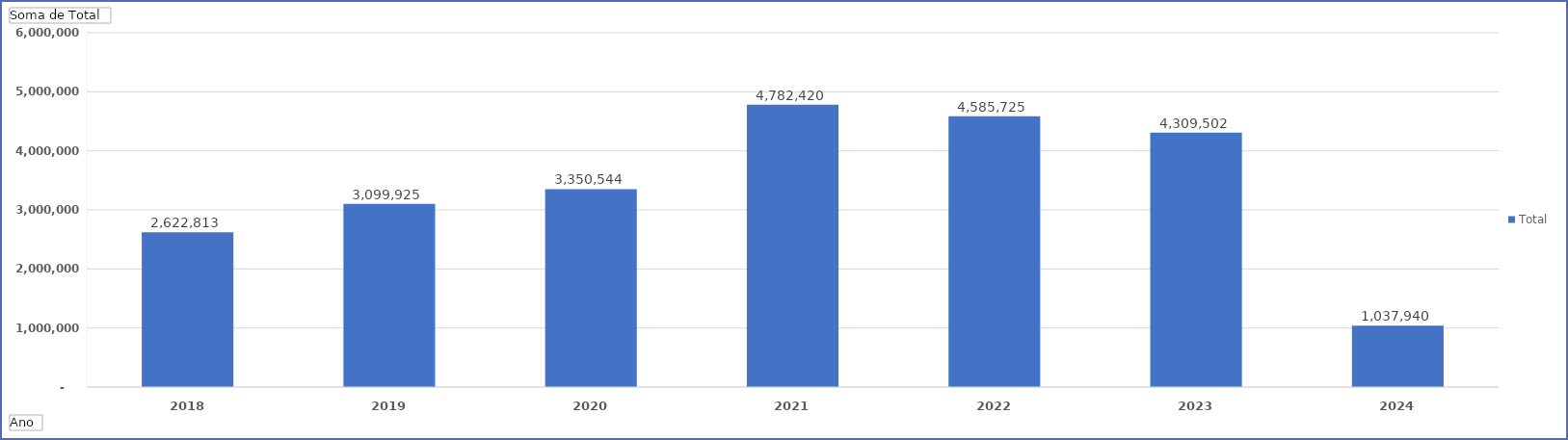
| Category | Total |
|---|---|
| 2018 | 2622813 |
| 2019 | 3099925 |
| 2020 | 3350544 |
| 2021 | 4782420 |
| 2022 | 4585725 |
| 2023 | 4309502 |
| 2024 | 1037940 |